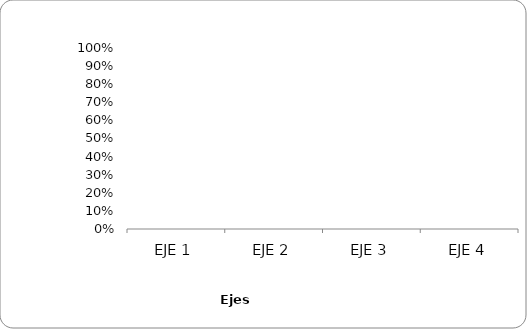
| Category | Series 0 |
|---|---|
| EJE 1 | 0 |
| EJE 2 | 0 |
| EJE 3 | 0 |
| EJE 4 | 0 |